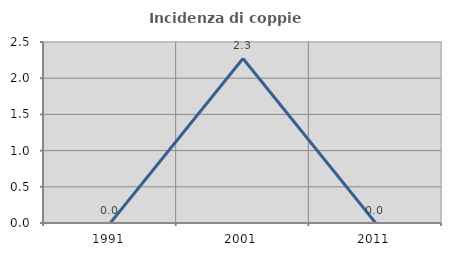
| Category | Incidenza di coppie miste |
|---|---|
| 1991.0 | 0 |
| 2001.0 | 2.273 |
| 2011.0 | 0 |